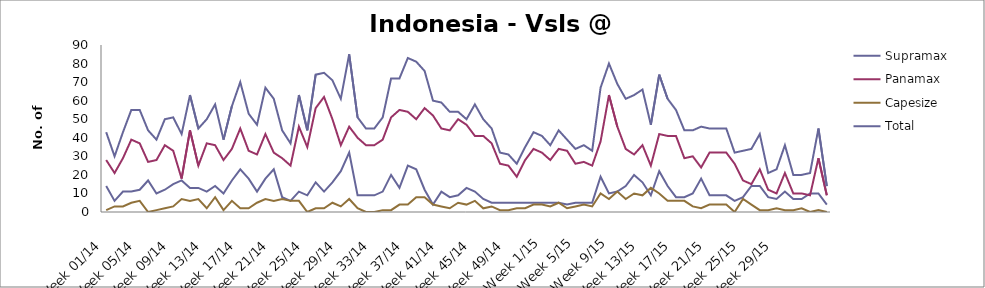
| Category | Supramax | Panamax | Capesize | Total |
|---|---|---|---|---|
| Week 01/14 | 14 | 28 | 1 | 43 |
| Week 02/14 | 6 | 21 | 3 | 30 |
| Week 03/14 | 11 | 29 | 3 | 43 |
| Week 04/14 | 11 | 39 | 5 | 55 |
| Week 05/14 | 12 | 37 | 6 | 55 |
| Week 06/14 | 17 | 27 | 0 | 44 |
| Week 07/14 | 10 | 28 | 1 | 39 |
| Week 08/14 | 12 | 36 | 2 | 50 |
| Week 09/14 | 15 | 33 | 3 | 51 |
| Week 10/14 | 17 | 18 | 7 | 42 |
| Week 11/14 | 13 | 44 | 6 | 63 |
| Week 12/14 | 13 | 25 | 7 | 45 |
| Week 13/14 | 11 | 37 | 2 | 50 |
| Week 14/14 | 14 | 36 | 8 | 58 |
| Week 15/14 | 10 | 28 | 1 | 39 |
| Week 16/14 | 17 | 34 | 6 | 57 |
| Week 17/14 | 23 | 45 | 2 | 70 |
| Week 18/14 | 18 | 33 | 2 | 53 |
| Week 19/14 | 11 | 31 | 5 | 47 |
| Week 20/14 | 18 | 42 | 7 | 67 |
| Week 21/14 | 23 | 32 | 6 | 61 |
| Week 22/14 | 8 | 29 | 7 | 44 |
| Week 23/14 | 6 | 25 | 6 | 37 |
| Week 24/14 | 11 | 46 | 6 | 63 |
| Week 25/14 | 9 | 35 | 0 | 44 |
| Week 26/14 | 16 | 56 | 2 | 74 |
| Week 27/14 | 11 | 62 | 2 | 75 |
| Week 28/14 | 16 | 50 | 5 | 71 |
| Week 29/14 | 22 | 36 | 3 | 61 |
| Week 30/14 | 32 | 46 | 7 | 85 |
| Week 31/14 | 9 | 40 | 2 | 51 |
| Week 32/14 | 9 | 36 | 0 | 45 |
| Week 33/14 | 9 | 36 | 0 | 45 |
| Week 34/14 | 11 | 39 | 1 | 51 |
| Week 35/14 | 20 | 51 | 1 | 72 |
| Week 36/14 | 13 | 55 | 4 | 72 |
| Week 37/14 | 25 | 54 | 4 | 83 |
| Week 38/14 | 23 | 50 | 8 | 81 |
| Week 39/14 | 12 | 56 | 8 | 76 |
| Week 40/14 | 4 | 52 | 4 | 60 |
| Week 41/14 | 11 | 45 | 3 | 59 |
| Week 42/14 | 8 | 44 | 2 | 54 |
| Week 43/14 | 9 | 50 | 5 | 54 |
| Week 44/14 | 13 | 47 | 4 | 50 |
| Week 45/14 | 11 | 41 | 6 | 58 |
| Week 46/14 | 7 | 41 | 2 | 50 |
| Week 47/14 | 5 | 37 | 3 | 45 |
| Week 48/14 | 5 | 26 | 1 | 32 |
| Week 49/14 | 5 | 25 | 1 | 31 |
| Week 50/14 | 5 | 19 | 2 | 26 |
| Week 51/14 | 5 | 28 | 2 | 35 |
| Week 52/14 | 5 | 34 | 4 | 43 |
| Week 1/15 | 5 | 32 | 4 | 41 |
| Week 2/15 | 5 | 28 | 3 | 36 |
| Week 3/15 | 5 | 34 | 5 | 44 |
| Week 4/15 | 4 | 33 | 2 | 39 |
| Week 5/15 | 5 | 26 | 3 | 34 |
| Week 6/15 | 5 | 27 | 4 | 36 |
| Week 7/15 | 5 | 25 | 3 | 33 |
| Week 8/15 | 19 | 38 | 10 | 67 |
| Week 9/15 | 10 | 63 | 7 | 80 |
| Week 10/15 | 11 | 46 | 11 | 69 |
| Week 11/15 | 14 | 34 | 7 | 61 |
| Week 12/15 | 20 | 31 | 10 | 63 |
| Week 13/15 | 16 | 36 | 9 | 66 |
| Week 14/15 | 9 | 25 | 13 | 47 |
| Week 15/15 | 22 | 42 | 10 | 74 |
| Week 16/15 | 14 | 41 | 6 | 61 |
| Week 17/15 | 8 | 41 | 6 | 55 |
| Week 18/15 | 8 | 29 | 6 | 44 |
| Week 19/15 | 10 | 30 | 3 | 44 |
| Week 20/15 | 18 | 24 | 2 | 46 |
| Week 21/15 | 9 | 32 | 4 | 45 |
| Week 22/15 | 9 | 32 | 4 | 45 |
| Week 23/15 | 9 | 32 | 4 | 45 |
| Week 24/15 | 6 | 26 | 0 | 32 |
| Week 25/15 | 8 | 17 | 7 | 33 |
| Week 26/15 | 14 | 15 | 4 | 34 |
| Week 27/15 | 14 | 23 | 1 | 42 |
| Week 28/15 | 8 | 12 | 1 | 21 |
| Week 29/15 | 7 | 10 | 2 | 23 |
| Week 30/15 | 11 | 21 | 1 | 36 |
| Week 31/15 | 7 | 10 | 1 | 20 |